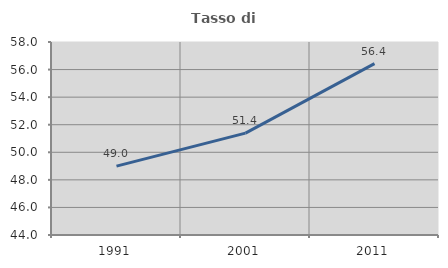
| Category | Tasso di occupazione   |
|---|---|
| 1991.0 | 48.993 |
| 2001.0 | 51.389 |
| 2011.0 | 56.429 |